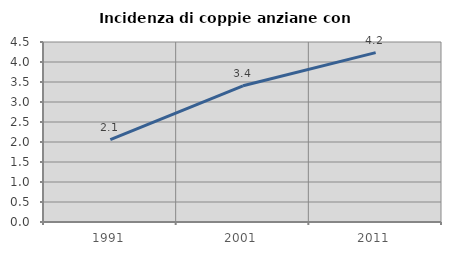
| Category | Incidenza di coppie anziane con figli |
|---|---|
| 1991.0 | 2.057 |
| 2001.0 | 3.405 |
| 2011.0 | 4.233 |